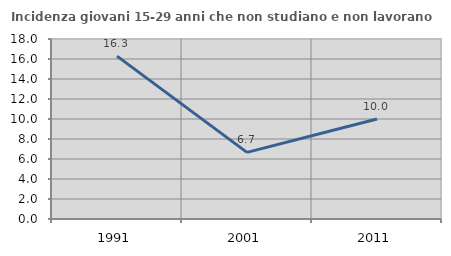
| Category | Incidenza giovani 15-29 anni che non studiano e non lavorano  |
|---|---|
| 1991.0 | 16.288 |
| 2001.0 | 6.667 |
| 2011.0 | 10 |